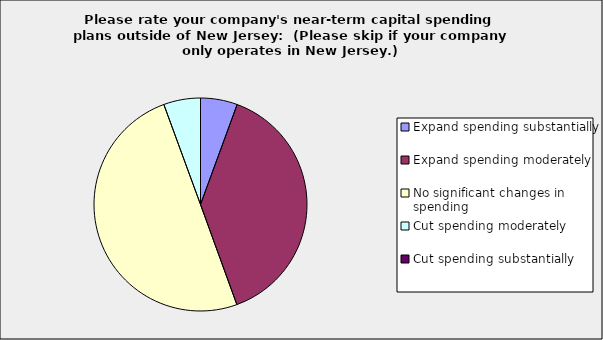
| Category | Series 0 |
|---|---|
| Expand spending substantially | 0.056 |
| Expand spending moderately | 0.389 |
| No significant changes in spending | 0.5 |
| Cut spending moderately | 0.056 |
| Cut spending substantially | 0 |